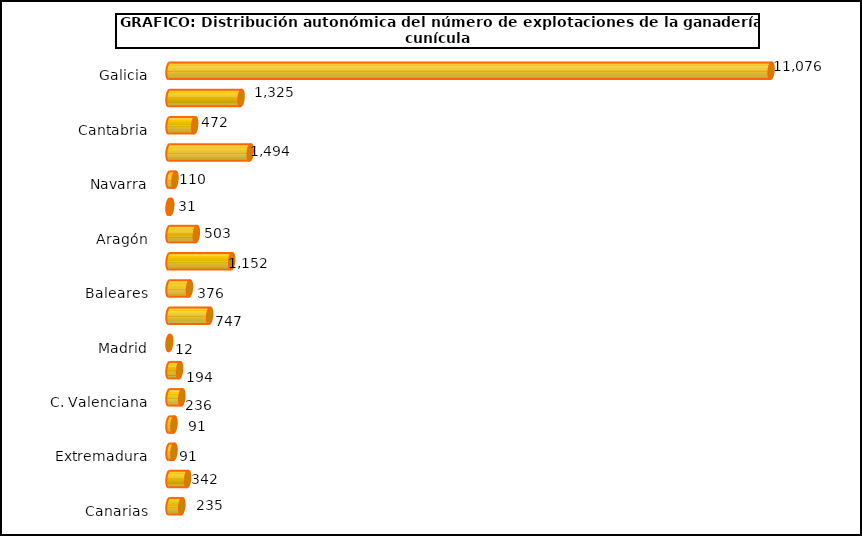
| Category | num. Explotaciones |
|---|---|
|   Galicia | 11076 |
|   P. de Asturias | 1325 |
|   Cantabria | 472 |
|   País Vasco | 1494 |
|   Navarra | 110 |
|   La Rioja | 31 |
|   Aragón | 503 |
|   Cataluña | 1152 |
|   Baleares | 376 |
|   Castilla y León | 747 |
|   Madrid | 12 |
|   Castilla – La Mancha | 194 |
|   C. Valenciana | 236 |
|   R. de Murcia | 91 |
|   Extremadura | 91 |
|   Andalucía | 342 |
|   Canarias | 235 |